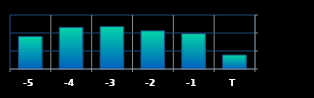
| Category | Series 0 |
|---|---|
| T | 77882 |
| -1 | 196394 |
| -2 | 211935 |
| -3 | 235469 |
| -4 | 231412 |
| -5 | 180982 |